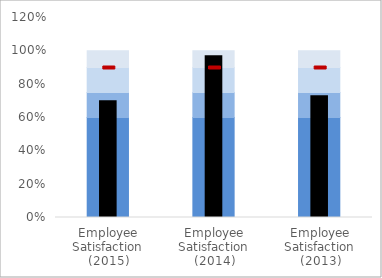
| Category | Poor | Fair | Good | Excellent |
|---|---|---|---|---|
| Employee Satisfaction (2015) | 0.6 | 0.15 | 0.15 | 0.1 |
| Employee Satisfaction (2014) | 0.6 | 0.15 | 0.15 | 0.1 |
| Employee Satisfaction (2013) | 0.6 | 0.15 | 0.15 | 0.1 |